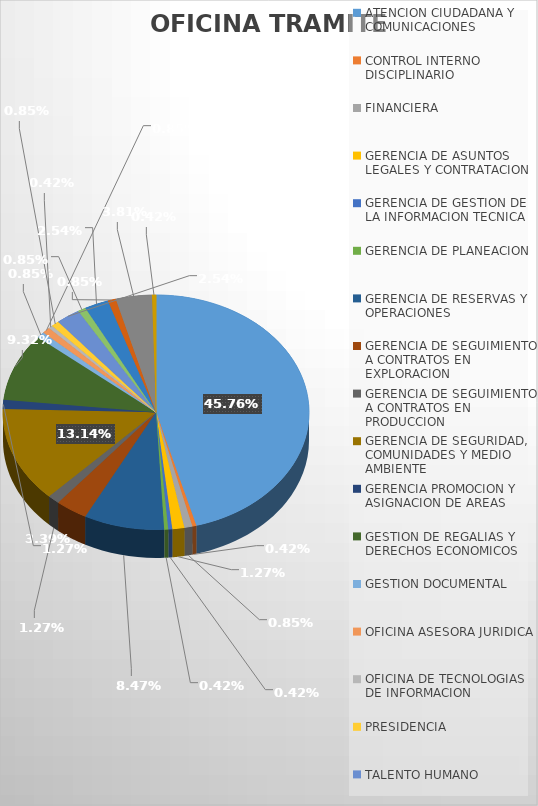
| Category | CANTIDAD |
|---|---|
| ATENCION CIUDADANA Y COMUNICACIONES | 108 |
| CONTROL INTERNO DISCIPLINARIO | 1 |
| FINANCIERA | 2 |
| GERENCIA DE ASUNTOS LEGALES Y CONTRATACION | 3 |
| GERENCIA DE GESTION DE LA INFORMACION TECNICA | 1 |
| GERENCIA DE PLANEACION | 1 |
| GERENCIA DE RESERVAS Y OPERACIONES | 20 |
| GERENCIA DE SEGUIMIENTO A CONTRATOS EN EXPLORACION | 8 |
| GERENCIA DE SEGUIMIENTO A CONTRATOS EN PRODUCCION | 3 |
| GERENCIA DE SEGURIDAD, COMUNIDADES Y MEDIO AMBIENTE | 31 |
| GERENCIA PROMOCION Y ASIGNACION DE AREAS | 3 |
| GESTION DE REGALIAS Y DERECHOS ECONOMICOS | 22 |
| GESTION DOCUMENTAL | 2 |
| OFICINA ASESORA JURIDICA | 2 |
| OFICINA DE TECNOLOGIAS DE INFORMACION | 1 |
| PRESIDENCIA | 2 |
| TALENTO HUMANO | 6 |
| VICEPRESIDENCIA ADMINISTRATIVA Y FINANCIERA | 2 |
| VICEPRESIDENCIA CONTRATOS DE HIDROCARBUROS | 6 |
| VICEPRESIDENCIA DE OPERACIONES, REGALIAS Y PARTICIPACIONES | 2 |
| VICEPRESIDENCIA PROMOCION Y ASIGNACION DE AREAS | 9 |
| VICEPRESIDENCIA TECNICA | 1 |